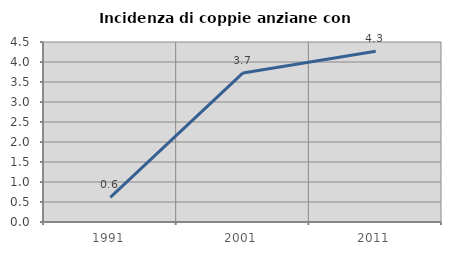
| Category | Incidenza di coppie anziane con figli |
|---|---|
| 1991.0 | 0.613 |
| 2001.0 | 3.727 |
| 2011.0 | 4.268 |